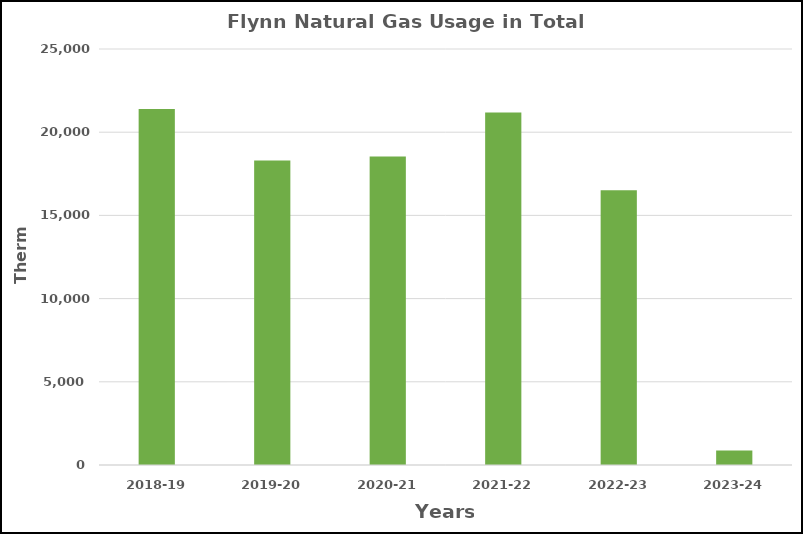
| Category | Series 0 |
|---|---|
| 2018-19 | 21401 |
| 2019-20 | 18295 |
| 2020-21 | 18534 |
| 2021-22 | 21179 |
| 2022-23 | 16513 |
| 2023-24 | 872 |